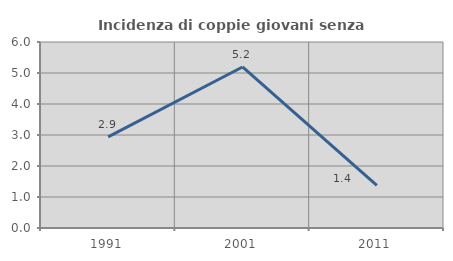
| Category | Incidenza di coppie giovani senza figli |
|---|---|
| 1991.0 | 2.941 |
| 2001.0 | 5.195 |
| 2011.0 | 1.376 |